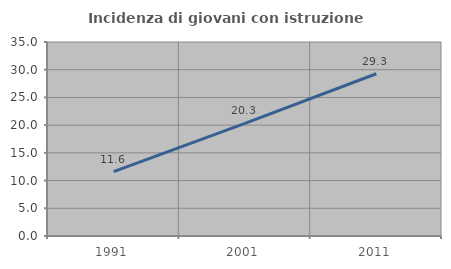
| Category | Incidenza di giovani con istruzione universitaria |
|---|---|
| 1991.0 | 11.628 |
| 2001.0 | 20.312 |
| 2011.0 | 29.268 |